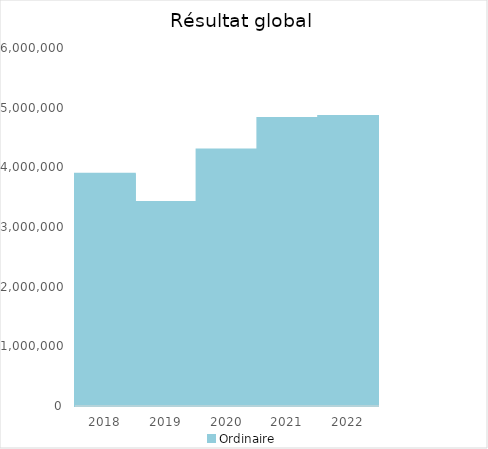
| Category |   | Ordinaire |    |
|---|---|---|---|
| 2018.0 |  | 3894475.08 |  |
| 2019.0 |  | 3418298.71 |  |
| 2020.0 |  | 4299955.62 |  |
| 2021.0 |  | 4825138.7 |  |
| 2022.0 |  | 4861601.54 |  |